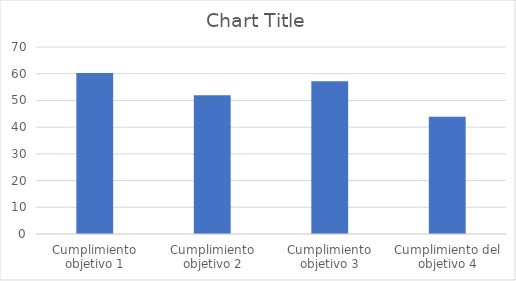
| Category | Series 0 |
|---|---|
| Cumplimiento objetivo 1 | 60.255 |
| Cumplimiento objetivo 2 | 51.919 |
| Cumplimiento objetivo 3 | 57.201 |
| Cumplimiento del objetivo 4 | 43.903 |